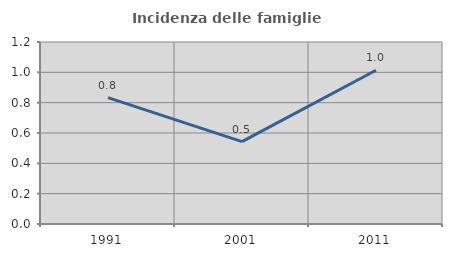
| Category | Incidenza delle famiglie numerose |
|---|---|
| 1991.0 | 0.834 |
| 2001.0 | 0.543 |
| 2011.0 | 1.014 |